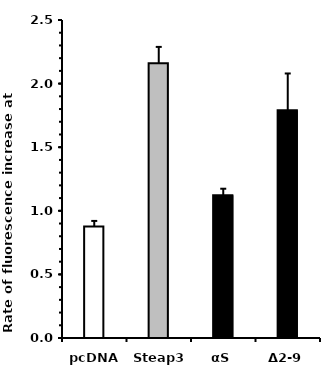
| Category | Untreated |
|---|---|
| pcDNA | 0.877 |
| Steap3 | 2.16 |
| αS | 1.123 |
| Δ2-9 | 1.791 |